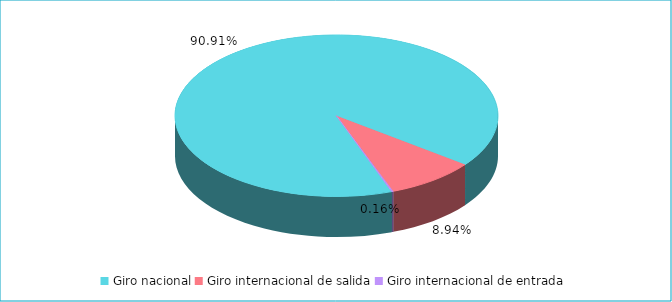
| Category | Series 0 |
|---|---|
| Giro nacional | 0.909 |
| Giro internacional de salida | 0.089 |
| Giro internacional de entrada | 0.002 |